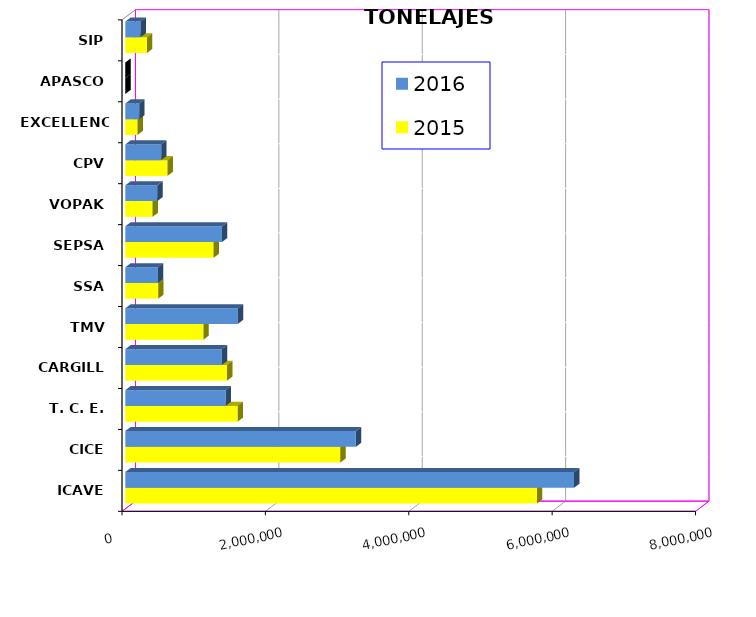
| Category | 2015 | 2016 |
|---|---|---|
| ICAVE | 5740903.766 | 6259748.9 |
| CICE | 2998594.748 | 3216182.976 |
| T. C. E. | 1566753.962 | 1399634.251 |
| CARGILL | 1418435.8 | 1347946.847 |
| TMV | 1089060.203 | 1568572.845 |
| SSA | 458273.65 | 455411.607 |
| SEPSA | 1231325.25 | 1348372.254 |
| VOPAK | 380318.239 | 446965.994 |
| CPV | 588489.95 | 500197.596 |
| EXCELLENCE | 170101.395 | 193795.81 |
| APASCO | 0 | 0 |
| SIP | 301577.11 | 211860.23 |